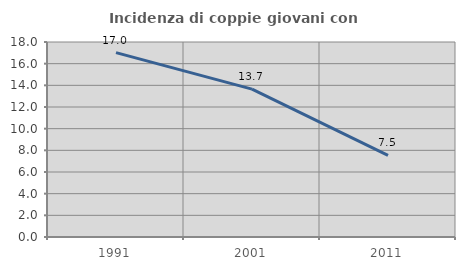
| Category | Incidenza di coppie giovani con figli |
|---|---|
| 1991.0 | 17.017 |
| 2001.0 | 13.654 |
| 2011.0 | 7.533 |